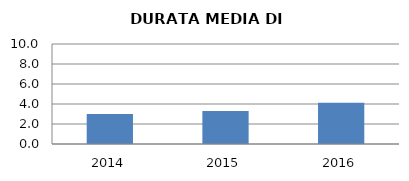
| Category | 2014 2015 2016 |
|---|---|
| 2014.0 | 3 |
| 2015.0 | 3.3 |
| 2016.0 | 4.121 |